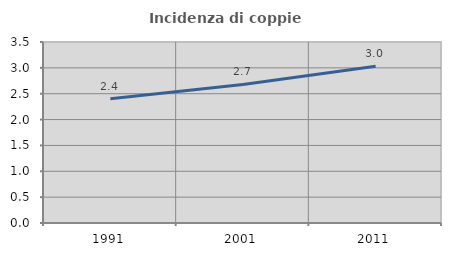
| Category | Incidenza di coppie miste |
|---|---|
| 1991.0 | 2.404 |
| 2001.0 | 2.679 |
| 2011.0 | 3.03 |